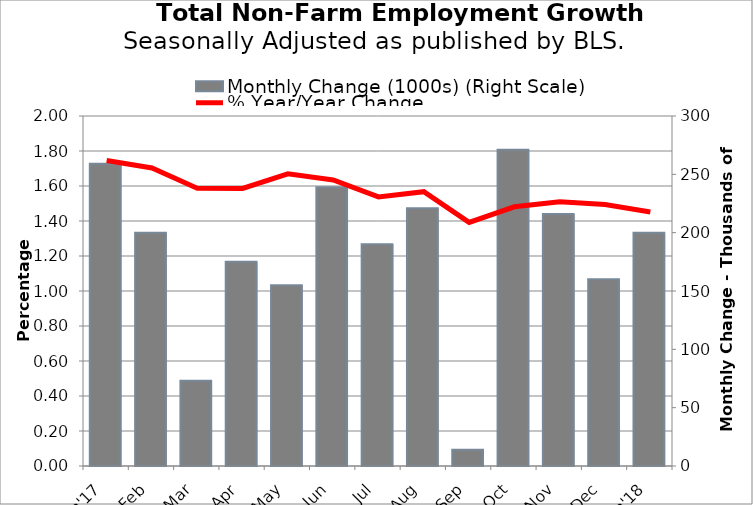
| Category | Monthly Change (1000s) (Right Scale) |
|---|---|
| Jan'17 | 259 |
| Feb | 200 |
| Mar | 73 |
| Apr | 175 |
| May | 155 |
| Jun | 239 |
| Jul | 190 |
| Aug | 221 |
| Sep | 14 |
| Oct | 271 |
| Nov | 216 |
| Dec | 160 |
| Jan'18 | 200 |